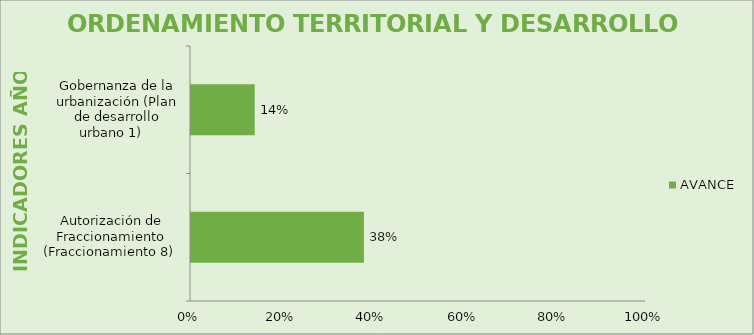
| Category | AVANCE |
|---|---|
| Autorización de Fraccionamiento (Fraccionamiento 8)   | 0.38 |
| Gobernanza de la urbanización (Plan de desarrollo urbano 1)    | 0.14 |